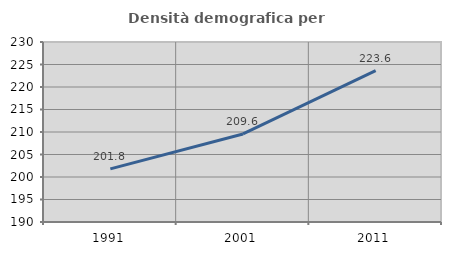
| Category | Densità demografica |
|---|---|
| 1991.0 | 201.812 |
| 2001.0 | 209.566 |
| 2011.0 | 223.633 |